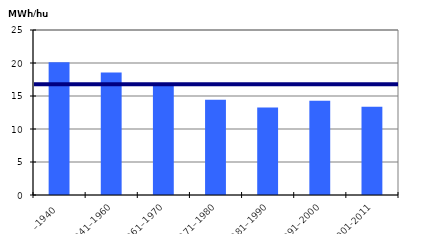
| Category | MWH/hus |
|---|---|
| –1940 | 20.127 |
| 1941–1960 | 18.563 |
| 1961–1970 | 16.83 |
| 1971–1980 | 14.416 |
| 1981–1990 | 13.273 |
| 1991–2000 | 14.284 |
| 2001-2011 | 13.372 |